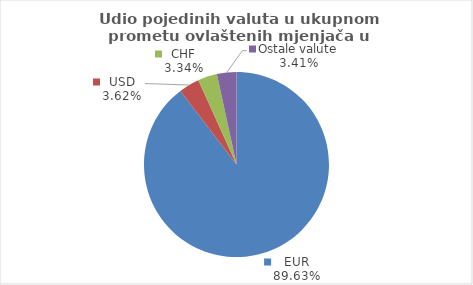
| Category | Series 0 |
|---|---|
| EUR | 89.631 |
| USD | 3.616 |
| CHF | 3.345 |
| Ostale valute | 3.408 |